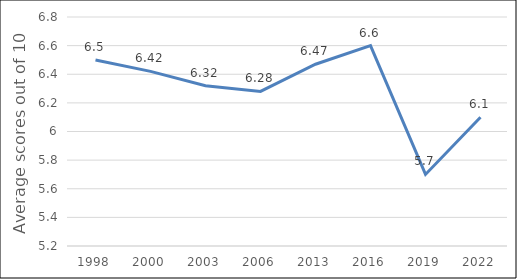
| Category | Average scores out of 10 |
|---|---|
| 1998.0 | 6.5 |
| 2000.0 | 6.42 |
| 2003.0 | 6.32 |
| 2006.0 | 6.28 |
| 2013.0 | 6.47 |
| 2016.0 | 6.6 |
| 2019.0 | 5.7 |
| 2022.0 | 6.1 |